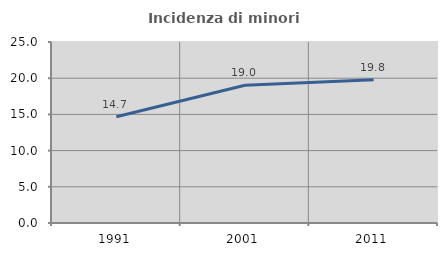
| Category | Incidenza di minori stranieri |
|---|---|
| 1991.0 | 14.685 |
| 2001.0 | 19.037 |
| 2011.0 | 19.796 |